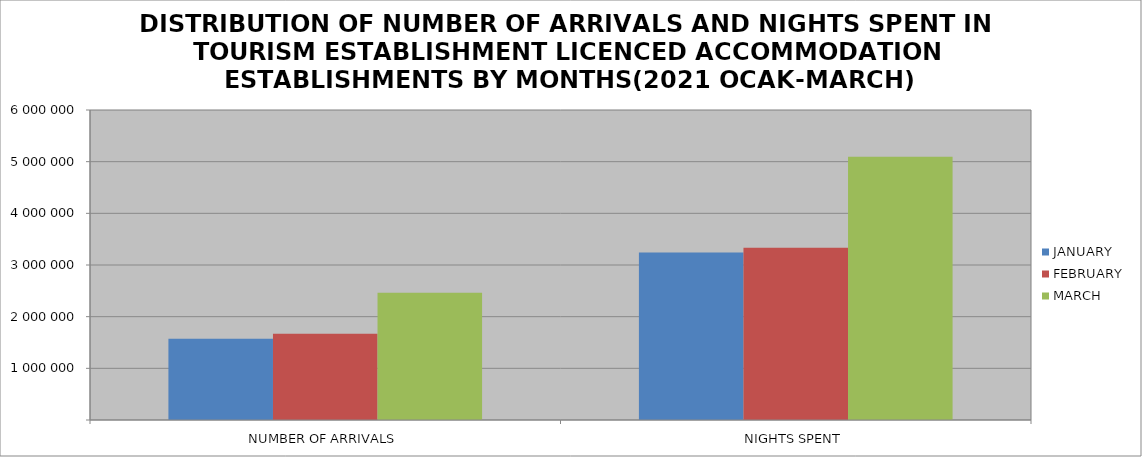
| Category | JANUARY | FEBRUARY | MARCH |
|---|---|---|---|
| NUMBER OF ARRIVALS | 1571594 | 1670164 | 2462715 |
| NIGHTS SPENT | 3239980 | 3333484 | 5094921 |